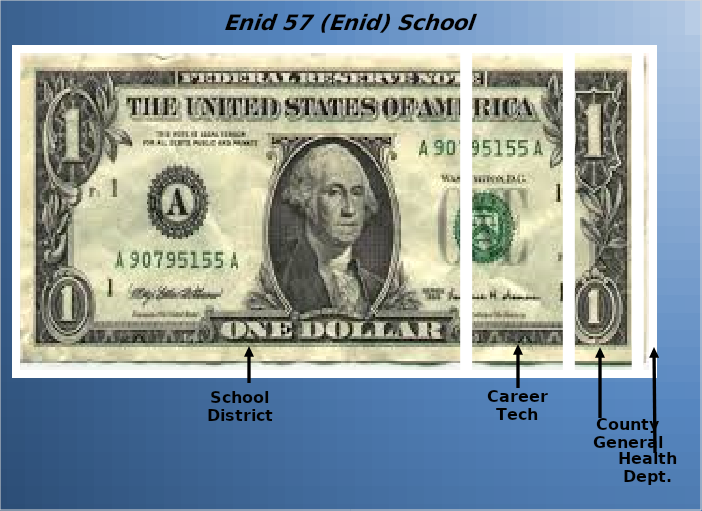
| Category | School District | Career Tech | County General | Health Dept. |
|---|---|---|---|---|
| 0 | 0.705 | 0.16 | 0.108 | 0.027 |